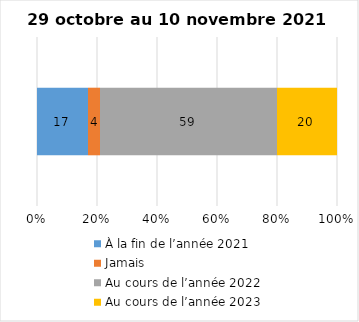
| Category | À la fin de l’année 2021 | Jamais | Au cours de l’année 2022 | Au cours de l’année 2023 |
|---|---|---|---|---|
| 0 | 17 | 4 | 59 | 20 |